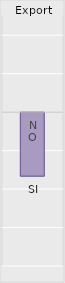
| Category | No | SI |
|---|---|---|
|  | 1 | 0.835 |